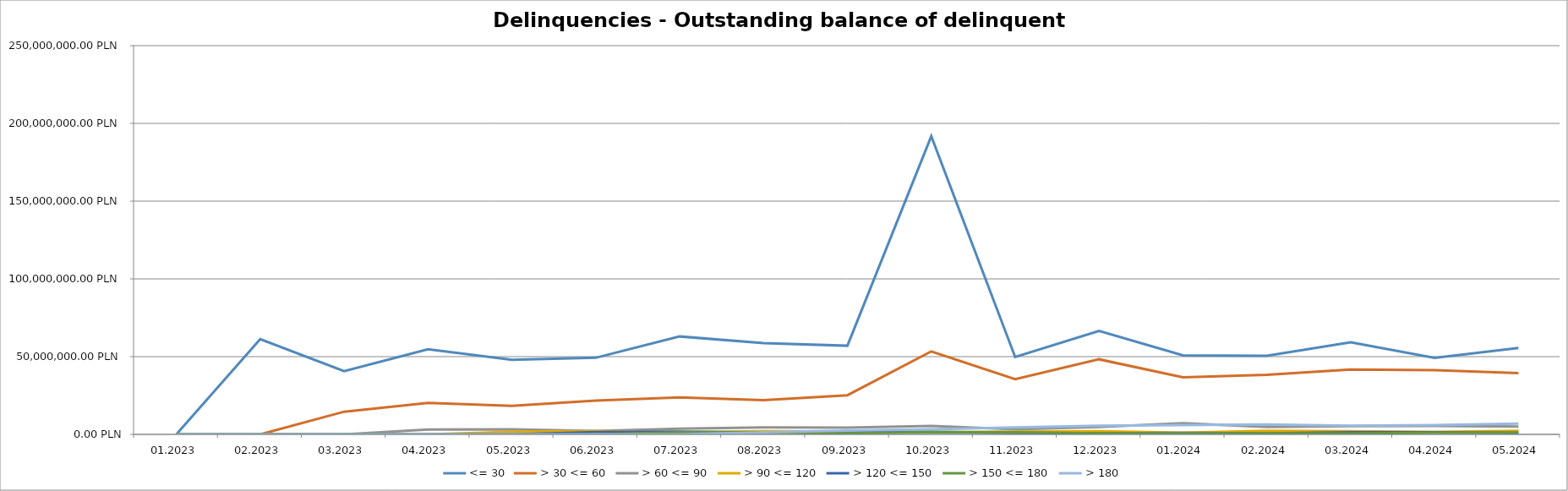
| Category | <= 30 | > 30 <= 60 | > 60 <= 90 | > 90 <= 120 | > 120 <= 150 | > 150 <= 180 | > 180 |
|---|---|---|---|---|---|---|---|
| 01.2023 | 0 | 0 | 0 | 0 | 0 | 0 | 0 |
| 02.2023 | 61279332.52 | 0 | 0 | 0 | 0 | 0 | 0 |
| 03.2023 | 40663789.15 | 14592814.21 | 0 | 0 | 0 | 0 | 0 |
| 04.2023 | 54729258.98 | 20207986.71 | 3105470.81 | 0 | 0 | 0 | 0 |
| 05.2023 | 47980491.52 | 18365026.23 | 3236930.39 | 1575049.71 | 0 | 0 | 0 |
| 06.2023 | 49274463.43 | 21757116.33 | 2145346.9 | 2234258.08 | 1546159.58 | 0 | 0 |
| 07.2023 | 62971390.96 | 23765504.45 | 3638339.96 | 1315739.52 | 1741228.92 | 1367122.32 | 0 |
| 08.2023 | 58667444.31 | 21958530.42 | 4534282.61 | 1998402.31 | 1197894.69 | 1186456.03 | 1367122.32 |
| 09.2023 | 57013090.09 | 25164417.49 | 4339269.75 | 1883194.82 | 1723494.5 | 705526.9 | 2508053.04 |
| 10.2023 | 191776280.48 | 53378945.55 | 5393392.38 | 1354505.77 | 1667300.89 | 1446484.43 | 3213579.94 |
| 11.2023 | 49723312.18 | 35482092.6 | 3276474.02 | 1813628.1 | 960023.75 | 1340003.09 | 4479480.65 |
| 12.2023 | 66557683.94 | 48283270.27 | 4762291.3 | 2048088.54 | 703260.31 | 730995.54 | 5619137.42 |
| 01.2024 | 50804141.07 | 36744266.23 | 7177545.74 | 1129913.48 | 940419.11 | 657491.3 | 5911358.03 |
| 02.2024 | 50502575.43 | 38257782.01 | 4690720.62 | 2248822.5 | 663999.75 | 739908.68 | 6397771.79 |
| 03.2024 | 59251403.37 | 41773061.64 | 5267891.93 | 2060309.75 | 1311500.28 | 495171.07 | 5532032.47 |
| 04.2024 | 49189246.11 | 41325536.37 | 5368172.18 | 1566464.96 | 1398336 | 1030908.19 | 5969684.4 |
| 05.2024 | 55609130.9 | 39461469.8 | 5042566.02 | 2293774.97 | 920364.59 | 1289237.67 | 6909707.6 |